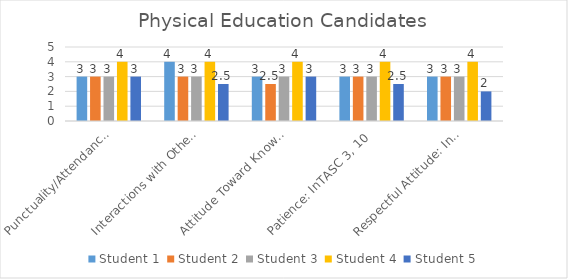
| Category | Student 1 | Student 2 | Student 3 | Student 4 | Student 5 |
|---|---|---|---|---|---|
| Punctuality/Attendance: InTASC 1, 9 | 3 | 3 | 3 | 4 | 3 |
| Interactions with Others: InTASC 3, 7, 10 | 4 | 3 | 3 | 4 | 2.5 |
| Attitude Toward Knowledge and Learning: InTASC 1, 4, 5, 9, 10 | 3 | 2.5 | 3 | 4 | 3 |
| Patience: InTASC 3, 10 | 3 | 3 | 3 | 4 | 2.5 |
| Respectful Attitude: InTASC 3, 7, 10 | 3 | 3 | 3 | 4 | 2 |